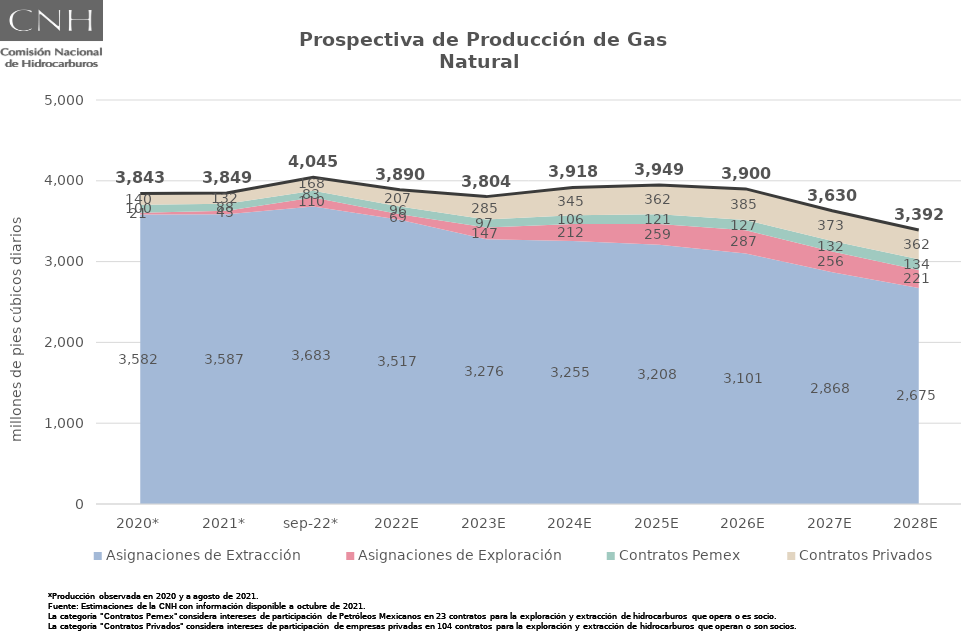
| Category | Total |
|---|---|
| 2020* | 3843.295 |
| 2021* | 3849.174 |
| sep-22* | 4044.539 |
| 2022E | 3890.001 |
| 2023E | 3804.235 |
| 2024E | 3917.733 |
| 2025E | 3949.45 |
| 2026E | 3899.858 |
| 2027E | 3629.832 |
| 2028E | 3391.873 |